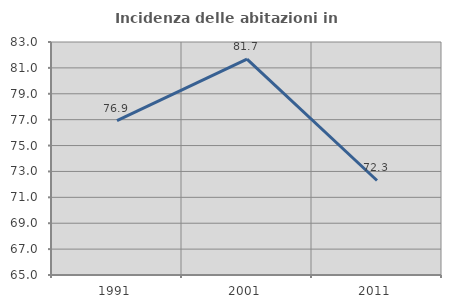
| Category | Incidenza delle abitazioni in proprietà  |
|---|---|
| 1991.0 | 76.923 |
| 2001.0 | 81.679 |
| 2011.0 | 72.302 |